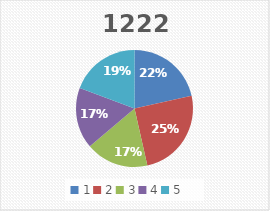
| Category | 1222 |
|---|---|
| 0 | 1.15 |
| 1 | 1.333 |
| 2 | 0.927 |
| 3 | 0.903 |
| 4 | 1.03 |